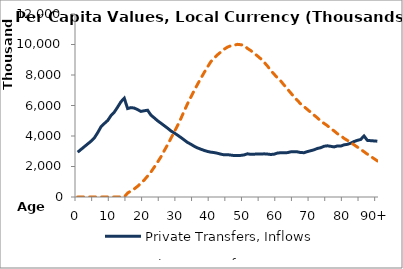
| Category | Private Transfers, Inflows | Private Transfers, Outflows |
|---|---|---|
| 0 | 2939286.621 | 0 |
|  | 3118634.191 | 0 |
| 2 | 3297981.761 | 0 |
| 3 | 3477329.332 | 0 |
| 4 | 3656676.902 | 0 |
| 5 | 3871647.003 | 0 |
| 6 | 4213075.937 | 0 |
| 7 | 4599664.161 | 0 |
| 8 | 4816672.796 | 0 |
| 9 | 5013561.174 | 0 |
| 10 | 5335316.524 | 0 |
| 11 | 5564455.289 | 0 |
| 12 | 5893984.52 | 0 |
| 13 | 6247142.897 | 0 |
| 14 | 6478911.621 | 0 |
| 15 | 5798840.942 | 260819.373 |
| 16 | 5859972.998 | 393806.503 |
| 17 | 5831910.244 | 532538.402 |
| 18 | 5730116.716 | 702408.89 |
| 19 | 5611491.025 | 907919.958 |
| 20 | 5654630.099 | 1114901.208 |
| 21 | 5690332.674 | 1372411.443 |
| 22 | 5371361.299 | 1639513.522 |
| 23 | 5188112.04 | 1956556.647 |
| 24 | 4998368.479 | 2287817.286 |
| 25 | 4840273.305 | 2628707.793 |
| 26 | 4678546.521 | 3035325.159 |
| 27 | 4512621.441 | 3426365.042 |
| 28 | 4335605.011 | 3842366.013 |
| 29 | 4199657.231 | 4265100.369 |
| 30 | 4056029.223 | 4685444.841 |
| 31 | 3901155.031 | 5142909.836 |
| 32 | 3740712.296 | 5640949.757 |
| 33 | 3575961.514 | 6115900.146 |
| 34 | 3460861.297 | 6553680.781 |
| 35 | 3327771.407 | 6982867.644 |
| 36 | 3218303.032 | 7391535.381 |
| 37 | 3133349.897 | 7780266.945 |
| 38 | 3054362.856 | 8165263.558 |
| 39 | 2986186.824 | 8524174.384 |
| 40 | 2940462.743 | 8876244.158 |
| 41 | 2912474.392 | 9104948.15 |
| 42 | 2867268.623 | 9326941.306 |
| 43 | 2808944.27 | 9509371.909 |
| 44 | 2766266.014 | 9691582.657 |
| 45 | 2777302.761 | 9829849.06 |
| 46 | 2747520.382 | 9916239.034 |
| 47 | 2718140.587 | 9951690.915 |
| 48 | 2714683.697 | 10010644.031 |
| 49 | 2729916.425 | 9984371.081 |
| 50 | 2758375.895 | 9946443.005 |
| 51 | 2833120.14 | 9737765.433 |
| 52 | 2796459.644 | 9601720.616 |
| 53 | 2805900.291 | 9425349.122 |
| 54 | 2826302.422 | 9248933.794 |
| 55 | 2817400.534 | 9062828.297 |
| 56 | 2829886.355 | 8836281.461 |
| 57 | 2815368.597 | 8587081.37 |
| 58 | 2787193.903 | 8300106.55 |
| 59 | 2809503.976 | 8053015.136 |
| 60 | 2879864.44 | 7815800.47 |
| 61 | 2902493.216 | 7604370.109 |
| 62 | 2903382.849 | 7336518.558 |
| 63 | 2910105.402 | 7077362.19 |
| 64 | 2961503.949 | 6823050.492 |
| 65 | 2963064.678 | 6558284.946 |
| 66 | 2959553.727 | 6332224.612 |
| 67 | 2912191.336 | 6098702.967 |
| 68 | 2907994.825 | 5924232.598 |
| 69 | 2978284.418 | 5736196.172 |
| 70 | 3034613.49 | 5553064.084 |
| 71 | 3096285.481 | 5366239.407 |
| 72 | 3183781.051 | 5187761.145 |
| 73 | 3232166.314 | 4985887.81 |
| 74 | 3327423.294 | 4827881.171 |
| 75 | 3357525.157 | 4675760.13 |
| 76 | 3323015.391 | 4487987.826 |
| 77 | 3283808.327 | 4336289.343 |
| 78 | 3347017.715 | 4152747.447 |
| 79 | 3337546.198 | 4019808.954 |
| 80 | 3419246.9 | 3846374.455 |
| 81 | 3453258.933 | 3715898.197 |
| 82 | 3529283.146 | 3569738.674 |
| 83 | 3636567.86 | 3421390.1 |
| 84 | 3715012.499 | 3274366.654 |
| 85 | 3771802.199 | 3123338.034 |
| 86 | 4000981.421 | 2969627.756 |
| 87 | 3711807.895 | 2809985.007 |
| 88 | 3694375.111 | 2662748.557 |
| 89 | 3676942.328 | 2515512.107 |
| 90+ | 3659509.544 | 2368275.658 |